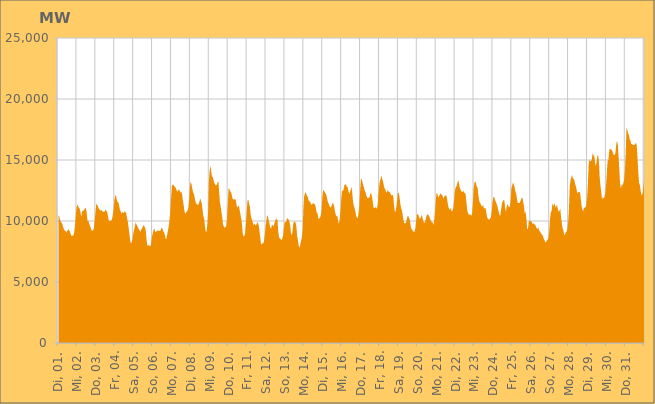
| Category | Series 0 |
|---|---|
|  Di, 01.  | 10445.464 |
|  Di, 01.  | 10418.709 |
|  Di, 01.  | 10096.872 |
|  Di, 01.  | 9958.419 |
|  Di, 01.  | 9845.258 |
|  Di, 01.  | 9771.267 |
|  Di, 01.  | 9507.485 |
|  Di, 01.  | 9325.082 |
|  Di, 01.  | 9214.585 |
|  Di, 01.  | 9182.414 |
|  Di, 01.  | 9061.254 |
|  Di, 01.  | 9199.429 |
|  Di, 01.  | 9218.825 |
|  Di, 01.  | 9339.716 |
|  Di, 01.  | 9198.846 |
|  Di, 01.  | 9057.448 |
|  Di, 01.  | 8848.611 |
|  Mi, 02.  | 8766.586 |
|  Mi, 02.  | 8821.806 |
|  Mi, 02.  | 8794.648 |
|  Mi, 02.  | 9035.269 |
|  Mi, 02.  | 9609.979 |
|  Mi, 02.  | 10371.984 |
|  Mi, 02.  | 11109.964 |
|  Mi, 02.  | 11357.362 |
|  Mi, 02.  | 11227.46 |
|  Mi, 02.  | 11087.301 |
|  Mi, 02.  | 11021.27 |
|  Mi, 02.  | 10733.815 |
|  Mi, 02.  | 10319.718 |
|  Mi, 02.  | 10776.171 |
|  Mi, 02.  | 10839.272 |
|  Mi, 02.  | 10856.523 |
|  Mi, 02.  | 10940.693 |
|  Mi, 02.  | 11051.533 |
|  Mi, 02.  | 11036.838 |
|  Mi, 02.  | 10600.894 |
|  Mi, 02.  | 9982.606 |
|  Mi, 02.  | 10026.646 |
|  Mi, 02.  | 9802.17 |
|  Mi, 02.  | 9641.317 |
|  Do, 03.  | 9458.63 |
|  Do, 03.  | 9241.382 |
|  Do, 03.  | 9191.766 |
|  Do, 03.  | 9231.051 |
|  Do, 03.  | 9385.842 |
|  Do, 03.  | 10025.51 |
|  Do, 03.  | 10662.96 |
|  Do, 03.  | 11415.449 |
|  Do, 03.  | 11334.333 |
|  Do, 03.  | 11218.548 |
|  Do, 03.  | 11035.067 |
|  Do, 03.  | 10975.332 |
|  Do, 03.  | 10847.702 |
|  Do, 03.  | 10857.642 |
|  Do, 03.  | 10905.208 |
|  Do, 03.  | 10751.52 |
|  Do, 03.  | 10772.236 |
|  Do, 03.  | 10732.425 |
|  Do, 03.  | 10810.365 |
|  Do, 03.  | 10943.887 |
|  Do, 03.  | 10811.847 |
|  Do, 03.  | 10715.231 |
|  Do, 03.  | 10348.574 |
|  Do, 03.  | 10020.668 |
|  Fr, 04.  | 9999.986 |
|  Fr, 04.  | 10034.949 |
|  Fr, 04.  | 10020.668 |
|  Fr, 04.  | 10132.877 |
|  Fr, 04.  | 10489.836 |
|  Fr, 04.  | 10882.149 |
|  Fr, 04.  | 11673.386 |
|  Fr, 04.  | 12049.748 |
|  Fr, 04.  | 12125.567 |
|  Fr, 04.  | 11767.253 |
|  Fr, 04.  | 11576.365 |
|  Fr, 04.  | 11563.829 |
|  Fr, 04.  | 11275.745 |
|  Fr, 04.  | 10942.059 |
|  Fr, 04.  | 10806.675 |
|  Fr, 04.  | 10606.895 |
|  Fr, 04.  | 10710.954 |
|  Fr, 04.  | 10692.391 |
|  Fr, 04.  | 10643.67 |
|  Fr, 04.  | 10804.127 |
|  Fr, 04.  | 10752.126 |
|  Fr, 04.  | 10632.463 |
|  Fr, 04.  | 10271.957 |
|  Fr, 04.  | 9978.367 |
|  Sa, 05.  | 9509.522 |
|  Sa, 05.  | 9017.733 |
|  Sa, 05.  | 8437.214 |
|  Sa, 05.  | 8170.574 |
|  Sa, 05.  | 8243.458 |
|  Sa, 05.  | 8507.864 |
|  Sa, 05.  | 8962.431 |
|  Sa, 05.  | 9278.351 |
|  Sa, 05.  | 9522.792 |
|  Sa, 05.  | 9893.677 |
|  Sa, 05.  | 9748.218 |
|  Sa, 05.  | 9625.984 |
|  Sa, 05.  | 9462.606 |
|  Sa, 05.  | 9334.758 |
|  Sa, 05.  | 9240.589 |
|  Sa, 05.  | 9074.091 |
|  Sa, 05.  | 9296.688 |
|  Sa, 05.  | 9354.751 |
|  Sa, 05.  | 9533.831 |
|  Sa, 05.  | 9658.156 |
|  Sa, 05.  | 9575.075 |
|  Sa, 05.  | 9471.217 |
|  Sa, 05.  | 9134.875 |
|  Sa, 05.  | 8411.449 |
|  So, 06.  | 7956.871 |
|  So, 06.  | 8050.751 |
|  So, 06.  | 7987.965 |
|  So, 06.  | 7960.885 |
|  So, 06.  | 7940.995 |
|  So, 06.  | 8335.815 |
|  So, 06.  | 8792.654 |
|  So, 06.  | 9020.529 |
|  So, 06.  | 9354.453 |
|  So, 06.  | 9328.236 |
|  So, 06.  | 9075.835 |
|  So, 06.  | 9135.225 |
|  So, 06.  | 9164.207 |
|  So, 06.  | 9241.171 |
|  So, 06.  | 9190.816 |
|  So, 06.  | 9192.103 |
|  So, 06.  | 9181.667 |
|  So, 06.  | 9268.434 |
|  So, 06.  | 9467.87 |
|  So, 06.  | 9378.282 |
|  So, 06.  | 9171.47 |
|  So, 06.  | 9077.974 |
|  So, 06.  | 8896.111 |
|  So, 06.  | 8571.984 |
|  Mo, 07.  | 8519.186 |
|  Mo, 07.  | 8881.387 |
|  Mo, 07.  | 9198.35 |
|  Mo, 07.  | 9563.819 |
|  Mo, 07.  | 10064.199 |
|  Mo, 07.  | 10751.741 |
|  Mo, 07.  | 11801.378 |
|  Mo, 07.  | 12866.73 |
|  Mo, 07.  | 12981.564 |
|  Mo, 07.  | 12968.536 |
|  Mo, 07.  | 12848.248 |
|  Mo, 07.  | 12817.554 |
|  Mo, 07.  | 12669.141 |
|  Mo, 07.  | 12555.159 |
|  Mo, 07.  | 12382.053 |
|  Mo, 07.  | 12528.935 |
|  Mo, 07.  | 12591.407 |
|  Mo, 07.  | 12476.338 |
|  Mo, 07.  | 12332.045 |
|  Mo, 07.  | 12387.739 |
|  Mo, 07.  | 12169.629 |
|  Mo, 07.  | 11699.822 |
|  Mo, 07.  | 11296.994 |
|  Mo, 07.  | 10793.262 |
|  Di, 08.  | 10580.791 |
|  Di, 08.  | 10699.864 |
|  Di, 08.  | 10763.95 |
|  Di, 08.  | 10883.133 |
|  Di, 08.  | 11123.467 |
|  Di, 08.  | 11825.29 |
|  Di, 08.  | 12886.145 |
|  Di, 08.  | 13228.791 |
|  Di, 08.  | 13005.547 |
|  Di, 08.  | 12631.881 |
|  Di, 08.  | 12336.314 |
|  Di, 08.  | 12217.979 |
|  Di, 08.  | 11891.708 |
|  Di, 08.  | 11595.922 |
|  Di, 08.  | 11404.761 |
|  Di, 08.  | 11396.87 |
|  Di, 08.  | 11304.569 |
|  Di, 08.  | 11384.354 |
|  Di, 08.  | 11591.286 |
|  Di, 08.  | 11842.987 |
|  Di, 08.  | 11641.229 |
|  Di, 08.  | 11431.126 |
|  Di, 08.  | 10885.895 |
|  Di, 08.  | 10387.662 |
|  Mi, 09.  | 10197.824 |
|  Mi, 09.  | 9535.286 |
|  Mi, 09.  | 9121.971 |
|  Mi, 09.  | 9124.669 |
|  Mi, 09.  | 9657.038 |
|  Mi, 09.  | 10759.996 |
|  Mi, 09.  | 13185.226 |
|  Mi, 09.  | 14133.47 |
|  Mi, 09.  | 14550.491 |
|  Mi, 09.  | 14040.788 |
|  Mi, 09.  | 13626.956 |
|  Mi, 09.  | 13596.723 |
|  Mi, 09.  | 13326.901 |
|  Mi, 09.  | 13116.424 |
|  Mi, 09.  | 12981.327 |
|  Mi, 09.  | 12899.271 |
|  Mi, 09.  | 12974.681 |
|  Mi, 09.  | 13164.518 |
|  Mi, 09.  | 13264.489 |
|  Mi, 09.  | 12394.088 |
|  Mi, 09.  | 11548.305 |
|  Mi, 09.  | 11174.405 |
|  Mi, 09.  | 10693.316 |
|  Mi, 09.  | 10256.487 |
|  Do, 10.  | 9670.03 |
|  Do, 10.  | 9550.203 |
|  Do, 10.  | 9443.122 |
|  Do, 10.  | 9521.739 |
|  Do, 10.  | 9551.376 |
|  Do, 10.  | 10214.007 |
|  Do, 10.  | 11374.113 |
|  Do, 10.  | 12642.246 |
|  Do, 10.  | 12646.609 |
|  Do, 10.  | 12420.489 |
|  Do, 10.  | 12398.847 |
|  Do, 10.  | 12138.475 |
|  Do, 10.  | 11846.262 |
|  Do, 10.  | 11744.314 |
|  Do, 10.  | 11822.299 |
|  Do, 10.  | 11745.597 |
|  Do, 10.  | 11771.239 |
|  Do, 10.  | 11347.421 |
|  Do, 10.  | 11088.747 |
|  Do, 10.  | 11196.392 |
|  Do, 10.  | 11278.337 |
|  Do, 10.  | 10907.245 |
|  Do, 10.  | 10573.962 |
|  Do, 10.  | 10214.93 |
|  Fr, 11.  | 9758.966 |
|  Fr, 11.  | 8945.916 |
|  Fr, 11.  | 8730.964 |
|  Fr, 11.  | 8778.282 |
|  Fr, 11.  | 9026.196 |
|  Fr, 11.  | 9791.639 |
|  Fr, 11.  | 10785.177 |
|  Fr, 11.  | 11675.182 |
|  Fr, 11.  | 11762.26 |
|  Fr, 11.  | 11445.646 |
|  Fr, 11.  | 11162.345 |
|  Fr, 11.  | 10539.326 |
|  Fr, 11.  | 10226.715 |
|  Fr, 11.  | 10047.195 |
|  Fr, 11.  | 9814.464 |
|  Fr, 11.  | 9623.07 |
|  Fr, 11.  | 9832.025 |
|  Fr, 11.  | 9642.455 |
|  Fr, 11.  | 9682.758 |
|  Fr, 11.  | 9804.745 |
|  Fr, 11.  | 9920.098 |
|  Fr, 11.  | 9723.935 |
|  Fr, 11.  | 9269.269 |
|  Fr, 11.  | 8778.418 |
|  Sa, 12.  | 8198.344 |
|  Sa, 12.  | 8073.735 |
|  Sa, 12.  | 8176.238 |
|  Sa, 12.  | 8159.395 |
|  Sa, 12.  | 8362.888 |
|  Sa, 12.  | 8935.742 |
|  Sa, 12.  | 9594.75 |
|  Sa, 12.  | 10005.846 |
|  Sa, 12.  | 10489.895 |
|  Sa, 12.  | 10332.899 |
|  Sa, 12.  | 10051.628 |
|  Sa, 12.  | 9756.363 |
|  Sa, 12.  | 9424.389 |
|  Sa, 12.  | 9396.178 |
|  Sa, 12.  | 9717.767 |
|  Sa, 12.  | 9652.435 |
|  Sa, 12.  | 9565.829 |
|  Sa, 12.  | 9756.081 |
|  Sa, 12.  | 9988.899 |
|  Sa, 12.  | 10163.077 |
|  Sa, 12.  | 10153.584 |
|  Sa, 12.  | 10069.986 |
|  Sa, 12.  | 9185.73 |
|  Sa, 12.  | 8671.08 |
|  So, 13.  | 8575.351 |
|  So, 13.  | 8525.437 |
|  So, 13.  | 8413.115 |
|  So, 13.  | 8556.65 |
|  So, 13.  | 8760.489 |
|  So, 13.  | 9284.699 |
|  So, 13.  | 9860.175 |
|  So, 13.  | 9921.62 |
|  So, 13.  | 9907.477 |
|  So, 13.  | 10180.38 |
|  So, 13.  | 10223.685 |
|  So, 13.  | 10134.553 |
|  So, 13.  | 9988.772 |
|  So, 13.  | 9748.794 |
|  So, 13.  | 9073.199 |
|  So, 13.  | 8825.75 |
|  So, 13.  | 9049.688 |
|  So, 13.  | 9726.017 |
|  So, 13.  | 9960.197 |
|  So, 13.  | 9936.151 |
|  So, 13.  | 9875.203 |
|  So, 13.  | 9578.62 |
|  So, 13.  | 8787.84 |
|  So, 13.  | 8430.383 |
|  Mo, 14.  | 7944.302 |
|  Mo, 14.  | 7816.863 |
|  Mo, 14.  | 8050.626 |
|  Mo, 14.  | 8414.837 |
|  Mo, 14.  | 8626.296 |
|  Mo, 14.  | 9366.381 |
|  Mo, 14.  | 11059.011 |
|  Mo, 14.  | 12081.918 |
|  Mo, 14.  | 12269.019 |
|  Mo, 14.  | 12361.258 |
|  Mo, 14.  | 12136.047 |
|  Mo, 14.  | 12029.801 |
|  Mo, 14.  | 11820.89 |
|  Mo, 14.  | 11621.163 |
|  Mo, 14.  | 11617.539 |
|  Mo, 14.  | 11463.048 |
|  Mo, 14.  | 11346.649 |
|  Mo, 14.  | 11316.121 |
|  Mo, 14.  | 11530.657 |
|  Mo, 14.  | 11397.134 |
|  Mo, 14.  | 11393.268 |
|  Mo, 14.  | 11328.83 |
|  Mo, 14.  | 10963.893 |
|  Mo, 14.  | 10625.857 |
|  Di, 15.  | 10635.923 |
|  Di, 15.  | 10156.694 |
|  Di, 15.  | 10219.404 |
|  Di, 15.  | 10268.465 |
|  Di, 15.  | 10445.948 |
|  Di, 15.  | 10896.16 |
|  Di, 15.  | 11916.351 |
|  Di, 15.  | 12530.404 |
|  Di, 15.  | 12504.649 |
|  Di, 15.  | 12360.847 |
|  Di, 15.  | 12277.934 |
|  Di, 15.  | 12153.535 |
|  Di, 15.  | 11861.07 |
|  Di, 15.  | 11530.995 |
|  Di, 15.  | 11432.026 |
|  Di, 15.  | 11238.038 |
|  Di, 15.  | 11107.588 |
|  Di, 15.  | 11130.987 |
|  Di, 15.  | 11273.801 |
|  Di, 15.  | 11455.131 |
|  Di, 15.  | 11427.941 |
|  Di, 15.  | 11179.973 |
|  Di, 15.  | 10796.721 |
|  Di, 15.  | 10509.534 |
|  Mi, 16.  | 10354.243 |
|  Mi, 16.  | 10472.428 |
|  Mi, 16.  | 9994.73 |
|  Mi, 16.  | 9767.031 |
|  Mi, 16.  | 10156.197 |
|  Mi, 16.  | 10761.795 |
|  Mi, 16.  | 11778.238 |
|  Mi, 16.  | 12515.685 |
|  Mi, 16.  | 12445.913 |
|  Mi, 16.  | 12587.203 |
|  Mi, 16.  | 12973.726 |
|  Mi, 16.  | 12959.537 |
|  Mi, 16.  | 13046.087 |
|  Mi, 16.  | 12795.419 |
|  Mi, 16.  | 12799.278 |
|  Mi, 16.  | 12495.666 |
|  Mi, 16.  | 12234.413 |
|  Mi, 16.  | 12354.62 |
|  Mi, 16.  | 12590.396 |
|  Mi, 16.  | 12789.416 |
|  Mi, 16.  | 12281.161 |
|  Mi, 16.  | 11561.756 |
|  Mi, 16.  | 11240.638 |
|  Mi, 16.  | 11046.175 |
|  Do, 17.  | 10722.483 |
|  Do, 17.  | 10405.416 |
|  Do, 17.  | 10255.874 |
|  Do, 17.  | 10246.881 |
|  Do, 17.  | 10717.739 |
|  Do, 17.  | 11364.88 |
|  Do, 17.  | 12513.894 |
|  Do, 17.  | 13510.762 |
|  Do, 17.  | 13390.363 |
|  Do, 17.  | 13168.081 |
|  Do, 17.  | 12906.054 |
|  Do, 17.  | 12694.257 |
|  Do, 17.  | 12452.881 |
|  Do, 17.  | 12325.718 |
|  Do, 17.  | 12046.968 |
|  Do, 17.  | 11886.159 |
|  Do, 17.  | 11863.35 |
|  Do, 17.  | 11910.553 |
|  Do, 17.  | 11970.423 |
|  Do, 17.  | 12260.793 |
|  Do, 17.  | 12278.518 |
|  Do, 17.  | 11994.866 |
|  Do, 17.  | 11559.318 |
|  Do, 17.  | 11088.349 |
|  Fr, 18.  | 11057.437 |
|  Fr, 18.  | 11086.801 |
|  Fr, 18.  | 11147.746 |
|  Fr, 18.  | 10990.685 |
|  Fr, 18.  | 11232.841 |
|  Fr, 18.  | 11956.96 |
|  Fr, 18.  | 12797.635 |
|  Fr, 18.  | 13253.006 |
|  Fr, 18.  | 13444.962 |
|  Fr, 18.  | 13745.08 |
|  Fr, 18.  | 13450.081 |
|  Fr, 18.  | 13229.051 |
|  Fr, 18.  | 12920.063 |
|  Fr, 18.  | 12675.783 |
|  Fr, 18.  | 12590.858 |
|  Fr, 18.  | 12327.997 |
|  Fr, 18.  | 12381.3 |
|  Fr, 18.  | 12541.785 |
|  Fr, 18.  | 12410.237 |
|  Fr, 18.  | 12402.682 |
|  Fr, 18.  | 12311.501 |
|  Fr, 18.  | 12165.941 |
|  Fr, 18.  | 12089.156 |
|  Fr, 18.  | 12150.967 |
|  Sa, 19.  | 12030.114 |
|  Sa, 19.  | 11278.958 |
|  Sa, 19.  | 10763.918 |
|  Sa, 19.  | 10788.405 |
|  Sa, 19.  | 11210.105 |
|  Sa, 19.  | 11744.894 |
|  Sa, 19.  | 12320.338 |
|  Sa, 19.  | 12298.313 |
|  Sa, 19.  | 11914.185 |
|  Sa, 19.  | 11415.359 |
|  Sa, 19.  | 11030.936 |
|  Sa, 19.  | 10876.905 |
|  Sa, 19.  | 10484.758 |
|  Sa, 19.  | 10045.198 |
|  Sa, 19.  | 9810.944 |
|  Sa, 19.  | 9805.409 |
|  Sa, 19.  | 9833.224 |
|  Sa, 19.  | 10067.073 |
|  Sa, 19.  | 10388.667 |
|  Sa, 19.  | 10412.128 |
|  Sa, 19.  | 10254.722 |
|  Sa, 19.  | 10108.428 |
|  Sa, 19.  | 9650.931 |
|  Sa, 19.  | 9350.06 |
|  So, 20.  | 9297.568 |
|  So, 20.  | 9172.188 |
|  So, 20.  | 9126.519 |
|  So, 20.  | 9120.719 |
|  So, 20.  | 9366.278 |
|  So, 20.  | 9958.761 |
|  So, 20.  | 10529.651 |
|  So, 20.  | 10583.754 |
|  So, 20.  | 10472.788 |
|  So, 20.  | 10263.972 |
|  So, 20.  | 10168.943 |
|  So, 20.  | 10326.722 |
|  So, 20.  | 10493.978 |
|  So, 20.  | 10292.968 |
|  So, 20.  | 10054.006 |
|  So, 20.  | 9853.987 |
|  So, 20.  | 9871.443 |
|  So, 20.  | 10063.49 |
|  So, 20.  | 10371.174 |
|  So, 20.  | 10523.983 |
|  So, 20.  | 10537.059 |
|  So, 20.  | 10456.552 |
|  So, 20.  | 10322.176 |
|  So, 20.  | 10135.839 |
|  Mo, 21.  | 10003.249 |
|  Mo, 21.  | 9883.222 |
|  Mo, 21.  | 9902.683 |
|  Mo, 21.  | 9659.618 |
|  Mo, 21.  | 10088.55 |
|  Mo, 21.  | 10769.328 |
|  Mo, 21.  | 11767.339 |
|  Mo, 21.  | 12290.931 |
|  Mo, 21.  | 12243.478 |
|  Mo, 21.  | 11925.409 |
|  Mo, 21.  | 12015.403 |
|  Mo, 21.  | 12154.759 |
|  Mo, 21.  | 12267.979 |
|  Mo, 21.  | 12194.842 |
|  Mo, 21.  | 12106.105 |
|  Mo, 21.  | 12000.505 |
|  Mo, 21.  | 11826.719 |
|  Mo, 21.  | 12064.948 |
|  Mo, 21.  | 12039.376 |
|  Mo, 21.  | 12156.405 |
|  Mo, 21.  | 11922.572 |
|  Mo, 21.  | 11494.535 |
|  Mo, 21.  | 11150.579 |
|  Mo, 21.  | 11005.016 |
|  Di, 22.  | 10919.888 |
|  Di, 22.  | 11079.734 |
|  Di, 22.  | 10780.149 |
|  Di, 22.  | 10841.677 |
|  Di, 22.  | 11010.445 |
|  Di, 22.  | 11540.604 |
|  Di, 22.  | 12346.178 |
|  Di, 22.  | 12720.024 |
|  Di, 22.  | 12796.995 |
|  Di, 22.  | 13023.873 |
|  Di, 22.  | 13224.217 |
|  Di, 22.  | 13322.865 |
|  Di, 22.  | 12826.573 |
|  Di, 22.  | 12634.784 |
|  Di, 22.  | 12476.488 |
|  Di, 22.  | 12403.969 |
|  Di, 22.  | 12382.868 |
|  Di, 22.  | 12490.571 |
|  Di, 22.  | 12273.354 |
|  Di, 22.  | 12350.5 |
|  Di, 22.  | 12111.552 |
|  Di, 22.  | 11422.872 |
|  Di, 22.  | 10827.287 |
|  Di, 22.  | 10624.555 |
|  Mi, 23.  | 10518.91 |
|  Mi, 23.  | 10528.204 |
|  Mi, 23.  | 10512.219 |
|  Mi, 23.  | 10423.695 |
|  Mi, 23.  | 10597.528 |
|  Mi, 23.  | 11462.949 |
|  Mi, 23.  | 12667.872 |
|  Mi, 23.  | 13138.069 |
|  Mi, 23.  | 13249.422 |
|  Mi, 23.  | 13098.551 |
|  Mi, 23.  | 12801.397 |
|  Mi, 23.  | 12732.389 |
|  Mi, 23.  | 12124.901 |
|  Mi, 23.  | 11688.649 |
|  Mi, 23.  | 11486.703 |
|  Mi, 23.  | 11415.793 |
|  Mi, 23.  | 11217.046 |
|  Mi, 23.  | 11206.274 |
|  Mi, 23.  | 11323.99 |
|  Mi, 23.  | 11054.957 |
|  Mi, 23.  | 11045.292 |
|  Mi, 23.  | 11062.268 |
|  Mi, 23.  | 10760.216 |
|  Mi, 23.  | 10350.828 |
|  Do, 24.  | 10182.865 |
|  Do, 24.  | 10120.813 |
|  Do, 24.  | 10130.373 |
|  Do, 24.  | 10211.642 |
|  Do, 24.  | 10325.924 |
|  Do, 24.  | 10818.516 |
|  Do, 24.  | 11550.954 |
|  Do, 24.  | 11960.476 |
|  Do, 24.  | 11963.759 |
|  Do, 24.  | 11758.817 |
|  Do, 24.  | 11583.332 |
|  Do, 24.  | 11429.507 |
|  Do, 24.  | 11257.569 |
|  Do, 24.  | 10957.264 |
|  Do, 24.  | 10717.208 |
|  Do, 24.  | 10457.338 |
|  Do, 24.  | 10482.308 |
|  Do, 24.  | 10981.876 |
|  Do, 24.  | 11435.953 |
|  Do, 24.  | 11631.583 |
|  Do, 24.  | 11716.376 |
|  Do, 24.  | 11670.767 |
|  Do, 24.  | 11078.058 |
|  Do, 24.  | 10743.859 |
|  Fr, 25.  | 11218.135 |
|  Fr, 25.  | 11392.787 |
|  Fr, 25.  | 11218.479 |
|  Fr, 25.  | 11105.928 |
|  Fr, 25.  | 11205.92 |
|  Fr, 25.  | 11724.759 |
|  Fr, 25.  | 12728.382 |
|  Fr, 25.  | 12905.725 |
|  Fr, 25.  | 13159.383 |
|  Fr, 25.  | 12994.287 |
|  Fr, 25.  | 12770.323 |
|  Fr, 25.  | 12434.372 |
|  Fr, 25.  | 12213.675 |
|  Fr, 25.  | 11810.318 |
|  Fr, 25.  | 11454.521 |
|  Fr, 25.  | 11488.016 |
|  Fr, 25.  | 11458.905 |
|  Fr, 25.  | 11553.213 |
|  Fr, 25.  | 11741.559 |
|  Fr, 25.  | 11894.322 |
|  Fr, 25.  | 11905.26 |
|  Fr, 25.  | 11568.174 |
|  Fr, 25.  | 11135.145 |
|  Fr, 25.  | 10568.313 |
|  Sa, 26.  | 10788.106 |
|  Sa, 26.  | 10162.947 |
|  Sa, 26.  | 9301.44 |
|  Sa, 26.  | 9384.197 |
|  Sa, 26.  | 9941.307 |
|  Sa, 26.  | 10053.886 |
|  Sa, 26.  | 10002.163 |
|  Sa, 26.  | 9950.406 |
|  Sa, 26.  | 9912.573 |
|  Sa, 26.  | 9729.231 |
|  Sa, 26.  | 9840.471 |
|  Sa, 26.  | 9670.487 |
|  Sa, 26.  | 9748.712 |
|  Sa, 26.  | 9547.098 |
|  Sa, 26.  | 9392.309 |
|  Sa, 26.  | 9329.982 |
|  Sa, 26.  | 9516.643 |
|  Sa, 26.  | 9260.475 |
|  Sa, 26.  | 9148.41 |
|  Sa, 26.  | 9040.61 |
|  Sa, 26.  | 8950.085 |
|  Sa, 26.  | 8863.109 |
|  Sa, 26.  | 8785.95 |
|  Sa, 26.  | 8540.483 |
|  So, 27.  | 8413.101 |
|  So, 27.  | 8235.325 |
|  So, 27.  | 8307.655 |
|  So, 27.  | 8383.064 |
|  So, 27.  | 8498.614 |
|  So, 27.  | 8622.173 |
|  So, 27.  | 9178.314 |
|  So, 27.  | 10188.571 |
|  So, 27.  | 10761.294 |
|  So, 27.  | 10793.536 |
|  So, 27.  | 11459.972 |
|  So, 27.  | 11272.835 |
|  So, 27.  | 11294.43 |
|  So, 27.  | 11461.218 |
|  So, 27.  | 11076.903 |
|  So, 27.  | 11245.225 |
|  So, 27.  | 11272.377 |
|  So, 27.  | 10935.539 |
|  So, 27.  | 10764.853 |
|  So, 27.  | 10832.885 |
|  So, 27.  | 11018.853 |
|  So, 27.  | 10267.955 |
|  So, 27.  | 9776.782 |
|  So, 27.  | 9389.484 |
|  So, 27.  | 9204.16 |
|  Mo, 28.  | 8829.113 |
|  Mo, 28.  | 8930.572 |
|  Mo, 28.  | 9060.347 |
|  Mo, 28.  | 9128.216 |
|  Mo, 28.  | 9318.843 |
|  Mo, 28.  | 9938.307 |
|  Mo, 28.  | 11038.687 |
|  Mo, 28.  | 12853.447 |
|  Mo, 28.  | 13325.594 |
|  Mo, 28.  | 13604.641 |
|  Mo, 28.  | 13766.334 |
|  Mo, 28.  | 13493.873 |
|  Mo, 28.  | 13431.37 |
|  Mo, 28.  | 13292.647 |
|  Mo, 28.  | 12964.416 |
|  Mo, 28.  | 12805.296 |
|  Mo, 28.  | 12443.475 |
|  Mo, 28.  | 12259.554 |
|  Mo, 28.  | 12376.706 |
|  Mo, 28.  | 12381.435 |
|  Mo, 28.  | 12337.119 |
|  Mo, 28.  | 11826.98 |
|  Mo, 28.  | 11237.507 |
|  Mo, 28.  | 10916.694 |
|  Di, 29.  | 10795.978 |
|  Di, 29.  | 11080.13 |
|  Di, 29.  | 11098.226 |
|  Di, 29.  | 11133.94 |
|  Di, 29.  | 11317.234 |
|  Di, 29.  | 11885.857 |
|  Di, 29.  | 13005.409 |
|  Di, 29.  | 14601.745 |
|  Di, 29.  | 15063.2 |
|  Di, 29.  | 14888.438 |
|  Di, 29.  | 14930.126 |
|  Di, 29.  | 15028.508 |
|  Di, 29.  | 15566.512 |
|  Di, 29.  | 15387.216 |
|  Di, 29.  | 15368.999 |
|  Di, 29.  | 14852.569 |
|  Di, 29.  | 14495.377 |
|  Di, 29.  | 14817.022 |
|  Di, 29.  | 15341.026 |
|  Di, 29.  | 15385.868 |
|  Di, 29.  | 14903.793 |
|  Di, 29.  | 13554.32 |
|  Di, 29.  | 12893.573 |
|  Di, 29.  | 12345.498 |
|  Mi, 30.  | 11757.896 |
|  Mi, 30.  | 11961.674 |
|  Mi, 30.  | 11857.071 |
|  Mi, 30.  | 11948.91 |
|  Mi, 30.  | 12251.418 |
|  Mi, 30.  | 12869.084 |
|  Mi, 30.  | 13849.732 |
|  Mi, 30.  | 14903.105 |
|  Mi, 30.  | 15010.128 |
|  Mi, 30.  | 15705.976 |
|  Mi, 30.  | 15946.448 |
|  Mi, 30.  | 15873.97 |
|  Mi, 30.  | 15840.059 |
|  Mi, 30.  | 15741.324 |
|  Mi, 30.  | 15548.53 |
|  Mi, 30.  | 15419.615 |
|  Mi, 30.  | 15409.205 |
|  Mi, 30.  | 15577.935 |
|  Mi, 30.  | 16294.7 |
|  Mi, 30.  | 16569.921 |
|  Mi, 30.  | 16260.274 |
|  Mi, 30.  | 15257.849 |
|  Mi, 30.  | 14051.786 |
|  Mi, 30.  | 12955.767 |
|  Do, 31.  | 12673.011 |
|  Do, 31.  | 13009.651 |
|  Do, 31.  | 12914.111 |
|  Do, 31.  | 13100.146 |
|  Do, 31.  | 13371.814 |
|  Do, 31.  | 14083.207 |
|  Do, 31.  | 15511.819 |
|  Do, 31.  | 17638.63 |
|  Do, 31.  | 17501.494 |
|  Do, 31.  | 17194.767 |
|  Do, 31.  | 17069.003 |
|  Do, 31.  | 16721.441 |
|  Do, 31.  | 16587.602 |
|  Do, 31.  | 16315.993 |
|  Do, 31.  | 16321.052 |
|  Do, 31.  | 16232.961 |
|  Do, 31.  | 16229.081 |
|  Do, 31.  | 16233.098 |
|  Do, 31.  | 16325.62 |
|  Do, 31.  | 16387.531 |
|  Do, 31.  | 16199.881 |
|  Do, 31.  | 15170.298 |
|  Do, 31.  | 13917.407 |
|  Do, 31.  | 13125.509 |
|  Fr, 01.  | 12923.748 |
|  Fr, 01.  | 12459.806 |
|  Fr, 01.  | 12142.604 |
|  Fr, 01.  | 12159.597 |
|  Fr, 01.  | 12394.256 |